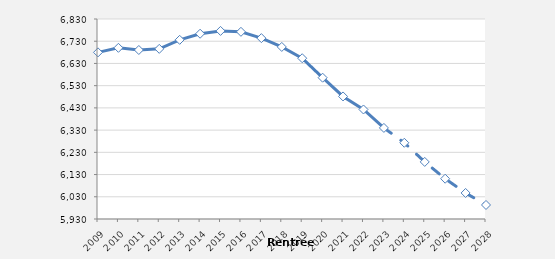
| Category | Series 0 |
|---|---|
| 2009.0 | 6679.822 |
| 2010.0 | 6700.335 |
| 2011.0 | 6690.547 |
| 2012.0 | 6695.679 |
| 2013.0 | 6736.22 |
| 2014.0 | 6763.717 |
| 2015.0 | 6776.398 |
| 2016.0 | 6772.329 |
| 2017.0 | 6743.962 |
| 2018.0 | 6704.319 |
| 2019.0 | 6653.465 |
| 2020.0 | 6565.847 |
| 2021.0 | 6481.517 |
| 2022.0 | 6422.791 |
| 2023.0 | 6339.913 |
| 2024.0 | 6273.04 |
| 2025.0 | 6186.92 |
| 2026.0 | 6111.309 |
| 2027.0 | 6047.174 |
| 2028.0 | 5993.088 |